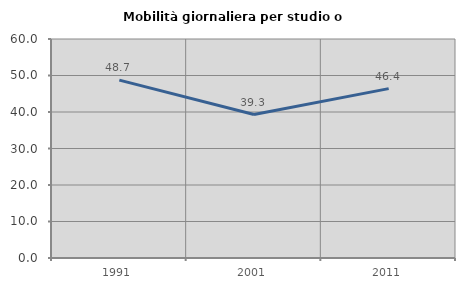
| Category | Mobilità giornaliera per studio o lavoro |
|---|---|
| 1991.0 | 48.744 |
| 2001.0 | 39.306 |
| 2011.0 | 46.4 |